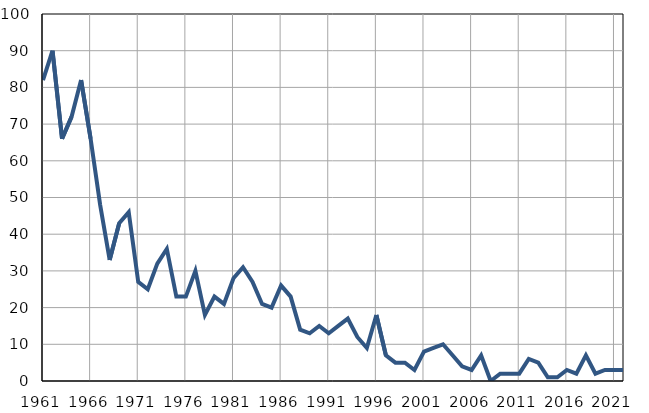
| Category | Infants
deaths |
|---|---|
| 1961.0 | 82 |
| 1962.0 | 90 |
| 1963.0 | 66 |
| 1964.0 | 72 |
| 1965.0 | 82 |
| 1966.0 | 66 |
| 1967.0 | 48 |
| 1968.0 | 33 |
| 1969.0 | 43 |
| 1970.0 | 46 |
| 1971.0 | 27 |
| 1972.0 | 25 |
| 1973.0 | 32 |
| 1974.0 | 36 |
| 1975.0 | 23 |
| 1976.0 | 23 |
| 1977.0 | 30 |
| 1978.0 | 18 |
| 1979.0 | 23 |
| 1980.0 | 21 |
| 1981.0 | 28 |
| 1982.0 | 31 |
| 1983.0 | 27 |
| 1984.0 | 21 |
| 1985.0 | 20 |
| 1986.0 | 26 |
| 1987.0 | 23 |
| 1988.0 | 14 |
| 1989.0 | 13 |
| 1990.0 | 15 |
| 1991.0 | 13 |
| 1992.0 | 15 |
| 1993.0 | 17 |
| 1994.0 | 12 |
| 1995.0 | 9 |
| 1996.0 | 18 |
| 1997.0 | 7 |
| 1998.0 | 5 |
| 1999.0 | 5 |
| 2000.0 | 3 |
| 2001.0 | 8 |
| 2002.0 | 9 |
| 2003.0 | 10 |
| 2004.0 | 7 |
| 2005.0 | 4 |
| 2006.0 | 3 |
| 2007.0 | 7 |
| 2008.0 | 0 |
| 2009.0 | 2 |
| 2010.0 | 2 |
| 2011.0 | 2 |
| 2012.0 | 6 |
| 2013.0 | 5 |
| 2014.0 | 1 |
| 2015.0 | 1 |
| 2016.0 | 3 |
| 2017.0 | 2 |
| 2018.0 | 7 |
| 2019.0 | 2 |
| 2020.0 | 3 |
| 2021.0 | 3 |
| 2022.0 | 3 |